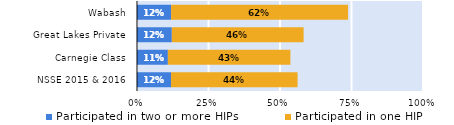
| Category | Participated in two or more HIPs | Participated in one HIP |
|---|---|---|
| NSSE 2015 & 2016 | 0.119 | 0.443 |
| Carnegie Class | 0.108 | 0.428 |
| Great Lakes Private | 0.122 | 0.461 |
| Wabash | 0.119 | 0.619 |